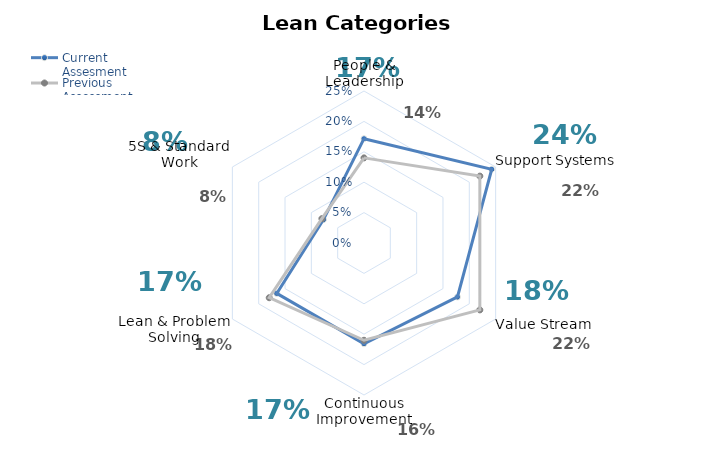
| Category | Current Assesment | Previous Assessment |
|---|---|---|
| People & Leadership | 0.172 | 0.14 |
| Support Systems | 0.243 | 0.22 |
| Value Stream | 0.178 | 0.22 |
| Continuous Improvement | 0.166 | 0.16 |
| Lean & Problem Solving | 0.166 | 0.18 |
| 5S & Standard Work | 0.077 | 0.08 |